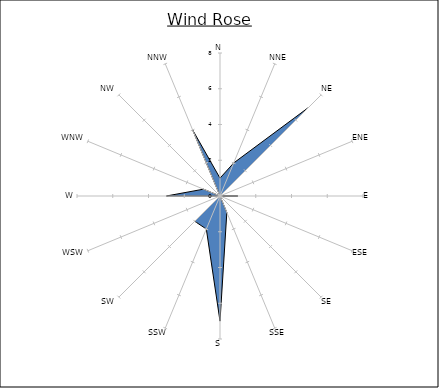
| Category | Series 0 |
|---|---|
| N | 1 |
| NNE | 2 |
| NE | 7 |
| ENE | 0 |
| E | 1 |
| ESE | 0 |
| SE | 0 |
| SSE | 1 |
| S | 7 |
| SSW | 2 |
| SW | 2 |
| WSW | 0 |
| W | 3 |
| WNW | 1 |
| NW | 0 |
| NNW | 4 |